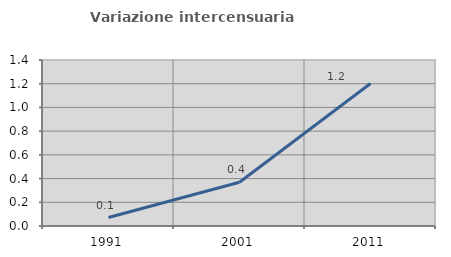
| Category | Variazione intercensuaria annua |
|---|---|
| 1991.0 | 0.072 |
| 2001.0 | 0.369 |
| 2011.0 | 1.202 |